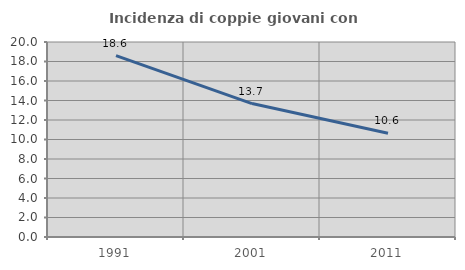
| Category | Incidenza di coppie giovani con figli |
|---|---|
| 1991.0 | 18.605 |
| 2001.0 | 13.686 |
| 2011.0 | 10.644 |